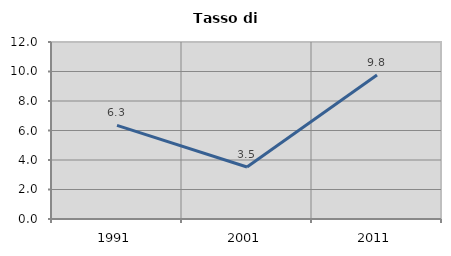
| Category | Tasso di disoccupazione   |
|---|---|
| 1991.0 | 6.347 |
| 2001.0 | 3.526 |
| 2011.0 | 9.766 |